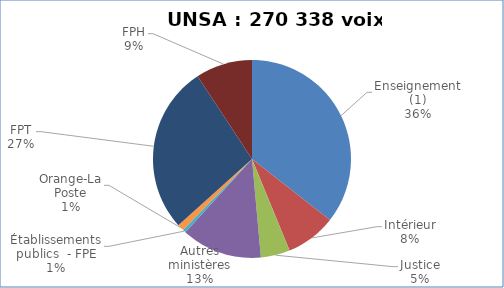
| Category | Nombre de voix |
|---|---|
| Enseignement (1) | 96174 |
| Intérieur | 22245 |
| Justice | 12888 |
| Autres ministères | 35600.8 |
| Établissements publics  - FPE | 1407.5 |
| Orange-La Poste | 2967.1 |
| FPT | 74005 |
| FPH | 25051 |